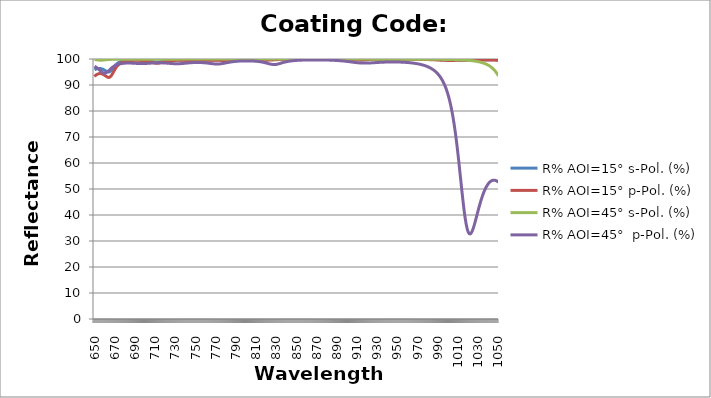
| Category | R% AOI=15° s-Pol. (%) | R% AOI=15° p-Pol. (%) | R% AOI=45° s-Pol. (%) | R% AOI=45°  p-Pol. (%) |
|---|---|---|---|---|
| 650.0 | 95.83 | 93.261 | 99.793 | 97.196 |
| 651.0 | 96.046 | 93.661 | 99.757 | 96.983 |
| 652.0 | 96.203 | 93.968 | 99.714 | 96.733 |
| 653.0 | 96.306 | 94.189 | 99.665 | 96.445 |
| 654.0 | 96.358 | 94.331 | 99.615 | 96.121 |
| 655.0 | 96.362 | 94.399 | 99.572 | 95.772 |
| 656.0 | 96.318 | 94.397 | 99.547 | 95.413 |
| 657.0 | 96.228 | 94.328 | 99.549 | 95.073 |
| 658.0 | 96.092 | 94.193 | 99.576 | 94.789 |
| 659.0 | 95.912 | 93.998 | 99.618 | 94.6 |
| 660.0 | 95.696 | 93.753 | 99.666 | 94.54 |
| 661.0 | 95.461 | 93.477 | 99.711 | 94.619 |
| 662.0 | 95.241 | 93.214 | 99.75 | 94.826 |
| 663.0 | 95.076 | 93.006 | 99.783 | 95.126 |
| 664.0 | 95.015 | 92.914 | 99.809 | 95.481 |
| 665.0 | 95.105 | 93 | 99.831 | 95.856 |
| 666.0 | 95.368 | 93.301 | 99.848 | 96.224 |
| 667.0 | 95.778 | 93.805 | 99.861 | 96.566 |
| 668.0 | 96.277 | 94.453 | 99.872 | 96.873 |
| 669.0 | 96.8 | 95.165 | 99.881 | 97.144 |
| 670.0 | 97.295 | 95.866 | 99.888 | 97.379 |
| 671.0 | 97.731 | 96.504 | 99.893 | 97.58 |
| 672.0 | 98.1 | 97.056 | 99.897 | 97.752 |
| 673.0 | 98.403 | 97.519 | 99.9 | 97.896 |
| 674.0 | 98.649 | 97.899 | 99.901 | 98.018 |
| 675.0 | 98.847 | 98.209 | 99.902 | 98.119 |
| 676.0 | 99.007 | 98.459 | 99.902 | 98.202 |
| 677.0 | 99.136 | 98.662 | 99.902 | 98.27 |
| 678.0 | 99.24 | 98.827 | 99.901 | 98.325 |
| 679.0 | 99.325 | 98.961 | 99.899 | 98.367 |
| 680.0 | 99.394 | 99.071 | 99.897 | 98.399 |
| 681.0 | 99.45 | 99.16 | 99.895 | 98.421 |
| 682.0 | 99.496 | 99.234 | 99.892 | 98.435 |
| 683.0 | 99.534 | 99.294 | 99.889 | 98.441 |
| 684.0 | 99.565 | 99.344 | 99.886 | 98.44 |
| 685.0 | 99.59 | 99.384 | 99.883 | 98.434 |
| 686.0 | 99.61 | 99.417 | 99.881 | 98.422 |
| 687.0 | 99.626 | 99.443 | 99.879 | 98.406 |
| 688.0 | 99.638 | 99.464 | 99.878 | 98.387 |
| 689.0 | 99.646 | 99.478 | 99.877 | 98.366 |
| 690.0 | 99.652 | 99.489 | 99.878 | 98.343 |
| 691.0 | 99.654 | 99.495 | 99.879 | 98.32 |
| 692.0 | 99.653 | 99.496 | 99.88 | 98.298 |
| 693.0 | 99.65 | 99.493 | 99.883 | 98.279 |
| 694.0 | 99.643 | 99.486 | 99.886 | 98.263 |
| 695.0 | 99.633 | 99.475 | 99.888 | 98.251 |
| 696.0 | 99.619 | 99.458 | 99.892 | 98.244 |
| 697.0 | 99.602 | 99.437 | 99.894 | 98.243 |
| 698.0 | 99.58 | 99.41 | 99.897 | 98.248 |
| 699.0 | 99.553 | 99.376 | 99.9 | 98.258 |
| 700.0 | 99.52 | 99.335 | 99.902 | 98.272 |
| 701.0 | 99.481 | 99.285 | 99.904 | 98.291 |
| 702.0 | 99.434 | 99.226 | 99.906 | 98.314 |
| 703.0 | 99.378 | 99.157 | 99.906 | 98.339 |
| 704.0 | 99.314 | 99.077 | 99.907 | 98.365 |
| 705.0 | 99.24 | 98.985 | 99.907 | 98.391 |
| 706.0 | 99.157 | 98.882 | 99.907 | 98.417 |
| 707.0 | 99.068 | 98.77 | 99.906 | 98.441 |
| 708.0 | 98.976 | 98.655 | 99.905 | 98.463 |
| 709.0 | 98.89 | 98.544 | 99.904 | 98.483 |
| 710.0 | 98.82 | 98.449 | 99.902 | 98.499 |
| 711.0 | 98.774 | 98.382 | 99.901 | 98.512 |
| 712.0 | 98.762 | 98.352 | 99.899 | 98.521 |
| 713.0 | 98.784 | 98.365 | 99.897 | 98.526 |
| 714.0 | 98.836 | 98.417 | 99.896 | 98.527 |
| 715.0 | 98.909 | 98.501 | 99.895 | 98.524 |
| 716.0 | 98.994 | 98.603 | 99.895 | 98.516 |
| 717.0 | 99.081 | 98.714 | 99.895 | 98.505 |
| 718.0 | 99.164 | 98.824 | 99.897 | 98.49 |
| 719.0 | 99.241 | 98.928 | 99.899 | 98.471 |
| 720.0 | 99.309 | 99.022 | 99.902 | 98.448 |
| 721.0 | 99.368 | 99.105 | 99.906 | 98.422 |
| 722.0 | 99.419 | 99.177 | 99.91 | 98.394 |
| 723.0 | 99.462 | 99.239 | 99.915 | 98.364 |
| 724.0 | 99.498 | 99.292 | 99.92 | 98.334 |
| 725.0 | 99.528 | 99.336 | 99.924 | 98.302 |
| 726.0 | 99.553 | 99.373 | 99.929 | 98.272 |
| 727.0 | 99.574 | 99.404 | 99.933 | 98.244 |
| 728.0 | 99.59 | 99.43 | 99.937 | 98.22 |
| 729.0 | 99.604 | 99.45 | 99.941 | 98.199 |
| 730.0 | 99.614 | 99.466 | 99.944 | 98.185 |
| 731.0 | 99.621 | 99.478 | 99.947 | 98.176 |
| 732.0 | 99.626 | 99.487 | 99.949 | 98.175 |
| 733.0 | 99.629 | 99.493 | 99.952 | 98.181 |
| 734.0 | 99.629 | 99.496 | 99.953 | 98.194 |
| 735.0 | 99.628 | 99.496 | 99.955 | 98.214 |
| 736.0 | 99.625 | 99.494 | 99.956 | 98.239 |
| 737.0 | 99.62 | 99.49 | 99.957 | 98.27 |
| 738.0 | 99.614 | 99.484 | 99.958 | 98.304 |
| 739.0 | 99.608 | 99.477 | 99.958 | 98.341 |
| 740.0 | 99.6 | 99.468 | 99.959 | 98.379 |
| 741.0 | 99.591 | 99.458 | 99.959 | 98.417 |
| 742.0 | 99.582 | 99.447 | 99.96 | 98.455 |
| 743.0 | 99.573 | 99.435 | 99.96 | 98.491 |
| 744.0 | 99.564 | 99.424 | 99.96 | 98.524 |
| 745.0 | 99.556 | 99.414 | 99.961 | 98.555 |
| 746.0 | 99.55 | 99.404 | 99.962 | 98.582 |
| 747.0 | 99.544 | 99.396 | 99.964 | 98.606 |
| 748.0 | 99.541 | 99.39 | 99.965 | 98.625 |
| 749.0 | 99.54 | 99.386 | 99.967 | 98.641 |
| 750.0 | 99.54 | 99.384 | 99.97 | 98.652 |
| 751.0 | 99.543 | 99.385 | 99.972 | 98.658 |
| 752.0 | 99.547 | 99.388 | 99.975 | 98.66 |
| 753.0 | 99.553 | 99.394 | 99.978 | 98.658 |
| 754.0 | 99.56 | 99.402 | 99.98 | 98.65 |
| 755.0 | 99.569 | 99.411 | 99.982 | 98.638 |
| 756.0 | 99.578 | 99.422 | 99.985 | 98.621 |
| 757.0 | 99.586 | 99.433 | 99.987 | 98.599 |
| 758.0 | 99.595 | 99.444 | 99.988 | 98.573 |
| 759.0 | 99.604 | 99.455 | 99.99 | 98.541 |
| 760.0 | 99.612 | 99.466 | 99.991 | 98.505 |
| 761.0 | 99.619 | 99.476 | 99.992 | 98.465 |
| 762.0 | 99.625 | 99.485 | 99.993 | 98.421 |
| 763.0 | 99.63 | 99.493 | 99.994 | 98.375 |
| 764.0 | 99.634 | 99.499 | 99.995 | 98.326 |
| 765.0 | 99.637 | 99.504 | 99.995 | 98.276 |
| 766.0 | 99.638 | 99.508 | 99.996 | 98.227 |
| 767.0 | 99.639 | 99.51 | 99.996 | 98.181 |
| 768.0 | 99.638 | 99.511 | 99.997 | 98.14 |
| 769.0 | 99.636 | 99.51 | 99.997 | 98.106 |
| 770.0 | 99.632 | 99.507 | 99.997 | 98.082 |
| 771.0 | 99.628 | 99.503 | 99.998 | 98.069 |
| 772.0 | 99.622 | 99.497 | 99.998 | 98.07 |
| 773.0 | 99.616 | 99.49 | 99.998 | 98.086 |
| 774.0 | 99.608 | 99.482 | 99.998 | 98.115 |
| 775.0 | 99.6 | 99.472 | 99.998 | 98.158 |
| 776.0 | 99.591 | 99.462 | 99.998 | 98.212 |
| 777.0 | 99.582 | 99.45 | 99.998 | 98.276 |
| 778.0 | 99.574 | 99.438 | 99.999 | 98.347 |
| 779.0 | 99.565 | 99.426 | 99.999 | 98.422 |
| 780.0 | 99.558 | 99.414 | 99.999 | 98.499 |
| 781.0 | 99.551 | 99.404 | 99.999 | 98.576 |
| 782.0 | 99.546 | 99.394 | 99.999 | 98.651 |
| 783.0 | 99.544 | 99.386 | 99.999 | 98.722 |
| 784.0 | 99.544 | 99.381 | 99.999 | 98.79 |
| 785.0 | 99.546 | 99.378 | 99.999 | 98.854 |
| 786.0 | 99.55 | 99.378 | 99.999 | 98.912 |
| 787.0 | 99.557 | 99.382 | 99.999 | 98.966 |
| 788.0 | 99.566 | 99.388 | 99.999 | 99.014 |
| 789.0 | 99.577 | 99.397 | 99.999 | 99.058 |
| 790.0 | 99.589 | 99.408 | 99.999 | 99.097 |
| 791.0 | 99.602 | 99.422 | 99.999 | 99.131 |
| 792.0 | 99.615 | 99.437 | 99.999 | 99.162 |
| 793.0 | 99.628 | 99.453 | 99.999 | 99.188 |
| 794.0 | 99.641 | 99.469 | 99.999 | 99.21 |
| 795.0 | 99.653 | 99.486 | 99.999 | 99.23 |
| 796.0 | 99.665 | 99.502 | 99.999 | 99.245 |
| 797.0 | 99.675 | 99.517 | 99.999 | 99.258 |
| 798.0 | 99.685 | 99.532 | 99.999 | 99.267 |
| 799.0 | 99.693 | 99.545 | 99.999 | 99.273 |
| 800.0 | 99.701 | 99.556 | 99.999 | 99.277 |
| 801.0 | 99.707 | 99.567 | 99.999 | 99.277 |
| 802.0 | 99.712 | 99.576 | 99.999 | 99.274 |
| 803.0 | 99.716 | 99.583 | 99.999 | 99.268 |
| 804.0 | 99.718 | 99.589 | 99.999 | 99.26 |
| 805.0 | 99.72 | 99.593 | 99.999 | 99.248 |
| 806.0 | 99.721 | 99.596 | 99.999 | 99.232 |
| 807.0 | 99.721 | 99.598 | 99.999 | 99.213 |
| 808.0 | 99.72 | 99.598 | 99.999 | 99.189 |
| 809.0 | 99.718 | 99.596 | 99.999 | 99.162 |
| 810.0 | 99.715 | 99.593 | 99.999 | 99.13 |
| 811.0 | 99.712 | 99.59 | 99.999 | 99.093 |
| 812.0 | 99.709 | 99.585 | 99.999 | 99.051 |
| 813.0 | 99.706 | 99.579 | 99.999 | 99.002 |
| 814.0 | 99.704 | 99.573 | 99.999 | 98.948 |
| 815.0 | 99.703 | 99.567 | 99.999 | 98.886 |
| 816.0 | 99.703 | 99.561 | 99.999 | 98.817 |
| 817.0 | 99.705 | 99.556 | 99.999 | 98.74 |
| 818.0 | 99.71 | 99.552 | 99.999 | 98.656 |
| 819.0 | 99.717 | 99.551 | 99.999 | 98.564 |
| 820.0 | 99.727 | 99.552 | 99.999 | 98.466 |
| 821.0 | 99.739 | 99.557 | 99.999 | 98.363 |
| 822.0 | 99.753 | 99.566 | 99.999 | 98.257 |
| 823.0 | 99.769 | 99.578 | 99.999 | 98.154 |
| 824.0 | 99.786 | 99.594 | 99.999 | 98.057 |
| 825.0 | 99.804 | 99.614 | 99.999 | 97.973 |
| 826.0 | 99.821 | 99.636 | 99.999 | 97.909 |
| 827.0 | 99.837 | 99.66 | 99.999 | 97.869 |
| 828.0 | 99.852 | 99.684 | 99.999 | 97.859 |
| 829.0 | 99.867 | 99.709 | 99.999 | 97.88 |
| 830.0 | 99.88 | 99.733 | 99.999 | 97.931 |
| 831.0 | 99.892 | 99.756 | 99.999 | 98.008 |
| 832.0 | 99.902 | 99.777 | 99.998 | 98.106 |
| 833.0 | 99.912 | 99.797 | 99.998 | 98.217 |
| 834.0 | 99.92 | 99.815 | 99.998 | 98.335 |
| 835.0 | 99.927 | 99.832 | 99.998 | 98.454 |
| 836.0 | 99.934 | 99.846 | 99.998 | 98.569 |
| 837.0 | 99.94 | 99.86 | 99.998 | 98.679 |
| 838.0 | 99.945 | 99.872 | 99.998 | 98.781 |
| 839.0 | 99.949 | 99.882 | 99.998 | 98.875 |
| 840.0 | 99.953 | 99.892 | 99.997 | 98.961 |
| 841.0 | 99.957 | 99.9 | 99.997 | 99.038 |
| 842.0 | 99.96 | 99.907 | 99.997 | 99.108 |
| 843.0 | 99.962 | 99.914 | 99.996 | 99.171 |
| 844.0 | 99.965 | 99.92 | 99.996 | 99.228 |
| 845.0 | 99.967 | 99.925 | 99.996 | 99.278 |
| 846.0 | 99.969 | 99.93 | 99.995 | 99.323 |
| 847.0 | 99.971 | 99.934 | 99.994 | 99.363 |
| 848.0 | 99.972 | 99.938 | 99.994 | 99.399 |
| 849.0 | 99.974 | 99.941 | 99.993 | 99.431 |
| 850.0 | 99.975 | 99.944 | 99.992 | 99.459 |
| 851.0 | 99.976 | 99.946 | 99.991 | 99.485 |
| 852.0 | 99.977 | 99.949 | 99.989 | 99.507 |
| 853.0 | 99.978 | 99.951 | 99.988 | 99.528 |
| 854.0 | 99.979 | 99.953 | 99.985 | 99.546 |
| 855.0 | 99.98 | 99.955 | 99.983 | 99.562 |
| 856.0 | 99.98 | 99.956 | 99.98 | 99.576 |
| 857.0 | 99.981 | 99.957 | 99.977 | 99.588 |
| 858.0 | 99.982 | 99.959 | 99.973 | 99.6 |
| 859.0 | 99.982 | 99.96 | 99.969 | 99.609 |
| 860.0 | 99.982 | 99.96 | 99.964 | 99.618 |
| 861.0 | 99.983 | 99.961 | 99.96 | 99.625 |
| 862.0 | 99.983 | 99.962 | 99.956 | 99.631 |
| 863.0 | 99.983 | 99.962 | 99.952 | 99.636 |
| 864.0 | 99.983 | 99.963 | 99.951 | 99.641 |
| 865.0 | 99.984 | 99.963 | 99.95 | 99.644 |
| 866.0 | 99.984 | 99.963 | 99.952 | 99.646 |
| 867.0 | 99.984 | 99.963 | 99.954 | 99.648 |
| 868.0 | 99.984 | 99.963 | 99.957 | 99.648 |
| 869.0 | 99.984 | 99.963 | 99.96 | 99.648 |
| 870.0 | 99.984 | 99.963 | 99.963 | 99.648 |
| 871.0 | 99.984 | 99.963 | 99.966 | 99.646 |
| 872.0 | 99.984 | 99.962 | 99.969 | 99.643 |
| 873.0 | 99.983 | 99.962 | 99.971 | 99.64 |
| 874.0 | 99.983 | 99.961 | 99.974 | 99.636 |
| 875.0 | 99.983 | 99.961 | 99.975 | 99.631 |
| 876.0 | 99.982 | 99.96 | 99.977 | 99.625 |
| 877.0 | 99.982 | 99.959 | 99.978 | 99.618 |
| 878.0 | 99.982 | 99.958 | 99.98 | 99.61 |
| 879.0 | 99.981 | 99.956 | 99.981 | 99.602 |
| 880.0 | 99.981 | 99.955 | 99.982 | 99.592 |
| 881.0 | 99.98 | 99.953 | 99.983 | 99.581 |
| 882.0 | 99.98 | 99.951 | 99.983 | 99.57 |
| 883.0 | 99.979 | 99.949 | 99.984 | 99.556 |
| 884.0 | 99.978 | 99.947 | 99.984 | 99.542 |
| 885.0 | 99.977 | 99.944 | 99.985 | 99.527 |
| 886.0 | 99.976 | 99.941 | 99.985 | 99.51 |
| 887.0 | 99.975 | 99.938 | 99.985 | 99.491 |
| 888.0 | 99.973 | 99.934 | 99.986 | 99.471 |
| 889.0 | 99.972 | 99.93 | 99.986 | 99.449 |
| 890.0 | 99.97 | 99.925 | 99.986 | 99.426 |
| 891.0 | 99.968 | 99.92 | 99.986 | 99.4 |
| 892.0 | 99.966 | 99.914 | 99.986 | 99.372 |
| 893.0 | 99.964 | 99.907 | 99.986 | 99.343 |
| 894.0 | 99.961 | 99.899 | 99.986 | 99.311 |
| 895.0 | 99.958 | 99.89 | 99.986 | 99.277 |
| 896.0 | 99.955 | 99.88 | 99.986 | 99.241 |
| 897.0 | 99.951 | 99.869 | 99.985 | 99.202 |
| 898.0 | 99.946 | 99.856 | 99.985 | 99.161 |
| 899.0 | 99.941 | 99.841 | 99.985 | 99.118 |
| 900.0 | 99.936 | 99.825 | 99.984 | 99.072 |
| 901.0 | 99.929 | 99.806 | 99.984 | 99.025 |
| 902.0 | 99.921 | 99.785 | 99.984 | 98.976 |
| 903.0 | 99.913 | 99.762 | 99.983 | 98.925 |
| 904.0 | 99.903 | 99.737 | 99.983 | 98.874 |
| 905.0 | 99.891 | 99.71 | 99.982 | 98.822 |
| 906.0 | 99.878 | 99.684 | 99.981 | 98.77 |
| 907.0 | 99.864 | 99.658 | 99.981 | 98.719 |
| 908.0 | 99.848 | 99.635 | 99.98 | 98.67 |
| 909.0 | 99.83 | 99.616 | 99.979 | 98.623 |
| 910.0 | 99.811 | 99.604 | 99.978 | 98.579 |
| 911.0 | 99.792 | 99.598 | 99.977 | 98.54 |
| 912.0 | 99.774 | 99.601 | 99.976 | 98.505 |
| 913.0 | 99.759 | 99.61 | 99.974 | 98.476 |
| 914.0 | 99.746 | 99.626 | 99.973 | 98.452 |
| 915.0 | 99.739 | 99.645 | 99.971 | 98.435 |
| 916.0 | 99.737 | 99.667 | 99.969 | 98.423 |
| 917.0 | 99.741 | 99.69 | 99.968 | 98.418 |
| 918.0 | 99.749 | 99.713 | 99.965 | 98.418 |
| 919.0 | 99.761 | 99.735 | 99.963 | 98.424 |
| 920.0 | 99.775 | 99.755 | 99.961 | 98.434 |
| 921.0 | 99.79 | 99.774 | 99.958 | 98.448 |
| 922.0 | 99.805 | 99.791 | 99.955 | 98.466 |
| 923.0 | 99.82 | 99.806 | 99.952 | 98.487 |
| 924.0 | 99.834 | 99.82 | 99.948 | 98.509 |
| 925.0 | 99.847 | 99.832 | 99.944 | 98.534 |
| 926.0 | 99.859 | 99.843 | 99.94 | 98.559 |
| 927.0 | 99.869 | 99.852 | 99.936 | 98.584 |
| 928.0 | 99.879 | 99.861 | 99.932 | 98.61 |
| 929.0 | 99.887 | 99.868 | 99.927 | 98.635 |
| 930.0 | 99.894 | 99.875 | 99.922 | 98.659 |
| 931.0 | 99.901 | 99.881 | 99.917 | 98.683 |
| 932.0 | 99.906 | 99.886 | 99.912 | 98.705 |
| 933.0 | 99.912 | 99.891 | 99.907 | 98.726 |
| 934.0 | 99.916 | 99.895 | 99.902 | 98.746 |
| 935.0 | 99.92 | 99.899 | 99.897 | 98.764 |
| 936.0 | 99.924 | 99.902 | 99.892 | 98.781 |
| 937.0 | 99.927 | 99.905 | 99.888 | 98.796 |
| 938.0 | 99.929 | 99.907 | 99.884 | 98.809 |
| 939.0 | 99.932 | 99.91 | 99.881 | 98.821 |
| 940.0 | 99.934 | 99.911 | 99.879 | 98.831 |
| 941.0 | 99.936 | 99.913 | 99.877 | 98.839 |
| 942.0 | 99.937 | 99.914 | 99.876 | 98.846 |
| 943.0 | 99.939 | 99.916 | 99.876 | 98.85 |
| 944.0 | 99.94 | 99.916 | 99.876 | 98.854 |
| 945.0 | 99.941 | 99.917 | 99.876 | 98.855 |
| 946.0 | 99.942 | 99.918 | 99.878 | 98.854 |
| 947.0 | 99.942 | 99.918 | 99.879 | 98.852 |
| 948.0 | 99.943 | 99.918 | 99.881 | 98.848 |
| 949.0 | 99.943 | 99.918 | 99.882 | 98.843 |
| 950.0 | 99.944 | 99.918 | 99.885 | 98.835 |
| 951.0 | 99.944 | 99.917 | 99.887 | 98.826 |
| 952.0 | 99.944 | 99.916 | 99.889 | 98.814 |
| 953.0 | 99.943 | 99.916 | 99.891 | 98.801 |
| 954.0 | 99.943 | 99.915 | 99.893 | 98.785 |
| 955.0 | 99.942 | 99.913 | 99.895 | 98.768 |
| 956.0 | 99.942 | 99.912 | 99.897 | 98.748 |
| 957.0 | 99.941 | 99.91 | 99.899 | 98.726 |
| 958.0 | 99.94 | 99.909 | 99.9 | 98.702 |
| 959.0 | 99.939 | 99.907 | 99.902 | 98.675 |
| 960.0 | 99.938 | 99.904 | 99.903 | 98.645 |
| 961.0 | 99.937 | 99.902 | 99.905 | 98.612 |
| 962.0 | 99.936 | 99.899 | 99.906 | 98.577 |
| 963.0 | 99.934 | 99.896 | 99.907 | 98.538 |
| 964.0 | 99.932 | 99.893 | 99.908 | 98.496 |
| 965.0 | 99.93 | 99.889 | 99.908 | 98.45 |
| 966.0 | 99.928 | 99.885 | 99.909 | 98.4 |
| 967.0 | 99.926 | 99.881 | 99.909 | 98.346 |
| 968.0 | 99.923 | 99.876 | 99.909 | 98.287 |
| 969.0 | 99.92 | 99.871 | 99.91 | 98.224 |
| 970.0 | 99.917 | 99.866 | 99.909 | 98.154 |
| 971.0 | 99.914 | 99.859 | 99.909 | 98.078 |
| 972.0 | 99.91 | 99.853 | 99.909 | 97.997 |
| 973.0 | 99.906 | 99.846 | 99.908 | 97.908 |
| 974.0 | 99.902 | 99.838 | 99.908 | 97.811 |
| 975.0 | 99.897 | 99.83 | 99.907 | 97.707 |
| 976.0 | 99.892 | 99.821 | 99.906 | 97.593 |
| 977.0 | 99.887 | 99.811 | 99.905 | 97.469 |
| 978.0 | 99.881 | 99.8 | 99.904 | 97.334 |
| 979.0 | 99.874 | 99.789 | 99.903 | 97.186 |
| 980.0 | 99.867 | 99.777 | 99.901 | 97.025 |
| 981.0 | 99.86 | 99.764 | 99.899 | 96.85 |
| 982.0 | 99.851 | 99.75 | 99.898 | 96.657 |
| 983.0 | 99.842 | 99.736 | 99.896 | 96.447 |
| 984.0 | 99.833 | 99.72 | 99.893 | 96.216 |
| 985.0 | 99.823 | 99.704 | 99.891 | 95.962 |
| 986.0 | 99.812 | 99.686 | 99.888 | 95.682 |
| 987.0 | 99.8 | 99.668 | 99.886 | 95.374 |
| 988.0 | 99.788 | 99.65 | 99.882 | 95.034 |
| 989.0 | 99.775 | 99.631 | 99.879 | 94.659 |
| 990.0 | 99.761 | 99.612 | 99.876 | 94.243 |
| 991.0 | 99.747 | 99.592 | 99.872 | 93.782 |
| 992.0 | 99.732 | 99.574 | 99.868 | 93.27 |
| 993.0 | 99.717 | 99.555 | 99.863 | 92.7 |
| 994.0 | 99.702 | 99.538 | 99.859 | 92.066 |
| 995.0 | 99.687 | 99.521 | 99.854 | 91.358 |
| 996.0 | 99.672 | 99.506 | 99.848 | 90.567 |
| 997.0 | 99.658 | 99.493 | 99.843 | 89.683 |
| 998.0 | 99.644 | 99.482 | 99.836 | 88.693 |
| 999.0 | 99.632 | 99.473 | 99.83 | 87.583 |
| 1000.0 | 99.621 | 99.466 | 99.823 | 86.34 |
| 1001.0 | 99.611 | 99.462 | 99.815 | 84.946 |
| 1002.0 | 99.603 | 99.459 | 99.807 | 83.385 |
| 1003.0 | 99.597 | 99.459 | 99.798 | 81.639 |
| 1004.0 | 99.593 | 99.461 | 99.789 | 79.688 |
| 1005.0 | 99.59 | 99.464 | 99.779 | 77.516 |
| 1006.0 | 99.59 | 99.47 | 99.768 | 75.108 |
| 1007.0 | 99.591 | 99.476 | 99.756 | 72.453 |
| 1008.0 | 99.593 | 99.483 | 99.744 | 69.548 |
| 1009.0 | 99.597 | 99.492 | 99.73 | 66.399 |
| 1010.0 | 99.602 | 99.5 | 99.716 | 63.027 |
| 1011.0 | 99.607 | 99.509 | 99.7 | 59.47 |
| 1012.0 | 99.614 | 99.518 | 99.683 | 55.785 |
| 1013.0 | 99.62 | 99.528 | 99.665 | 52.053 |
| 1014.0 | 99.627 | 99.537 | 99.645 | 48.372 |
| 1015.0 | 99.634 | 99.546 | 99.624 | 44.857 |
| 1016.0 | 99.642 | 99.554 | 99.601 | 41.626 |
| 1017.0 | 99.649 | 99.562 | 99.576 | 38.792 |
| 1018.0 | 99.656 | 99.57 | 99.549 | 36.449 |
| 1019.0 | 99.663 | 99.577 | 99.52 | 34.66 |
| 1020.0 | 99.669 | 99.584 | 99.488 | 33.454 |
| 1021.0 | 99.675 | 99.59 | 99.454 | 32.819 |
| 1022.0 | 99.681 | 99.596 | 99.416 | 32.715 |
| 1023.0 | 99.686 | 99.602 | 99.376 | 33.075 |
| 1024.0 | 99.692 | 99.606 | 99.331 | 33.818 |
| 1025.0 | 99.696 | 99.61 | 99.283 | 34.859 |
| 1026.0 | 99.7 | 99.614 | 99.229 | 36.116 |
| 1027.0 | 99.704 | 99.617 | 99.171 | 37.512 |
| 1028.0 | 99.707 | 99.62 | 99.108 | 38.985 |
| 1029.0 | 99.71 | 99.622 | 99.038 | 40.482 |
| 1030.0 | 99.713 | 99.623 | 98.961 | 41.962 |
| 1031.0 | 99.715 | 99.624 | 98.877 | 43.394 |
| 1032.0 | 99.716 | 99.625 | 98.784 | 44.756 |
| 1033.0 | 99.718 | 99.625 | 98.682 | 46.03 |
| 1034.0 | 99.719 | 99.624 | 98.569 | 47.208 |
| 1035.0 | 99.719 | 99.623 | 98.444 | 48.283 |
| 1036.0 | 99.719 | 99.622 | 98.306 | 49.252 |
| 1037.0 | 99.719 | 99.62 | 98.153 | 50.114 |
| 1038.0 | 99.718 | 99.617 | 97.983 | 50.871 |
| 1039.0 | 99.717 | 99.614 | 97.794 | 51.523 |
| 1040.0 | 99.716 | 99.61 | 97.584 | 52.073 |
| 1041.0 | 99.714 | 99.606 | 97.349 | 52.525 |
| 1042.0 | 99.712 | 99.601 | 97.087 | 52.88 |
| 1043.0 | 99.709 | 99.596 | 96.795 | 53.142 |
| 1044.0 | 99.706 | 99.59 | 96.467 | 53.313 |
| 1045.0 | 99.703 | 99.583 | 96.1 | 53.397 |
| 1046.0 | 99.699 | 99.576 | 95.689 | 53.395 |
| 1047.0 | 99.695 | 99.568 | 95.227 | 53.31 |
| 1048.0 | 99.69 | 99.559 | 94.708 | 53.144 |
| 1049.0 | 99.684 | 99.55 | 94.124 | 52.899 |
| 1050.0 | 99.679 | 99.54 | 93.469 | 52.577 |